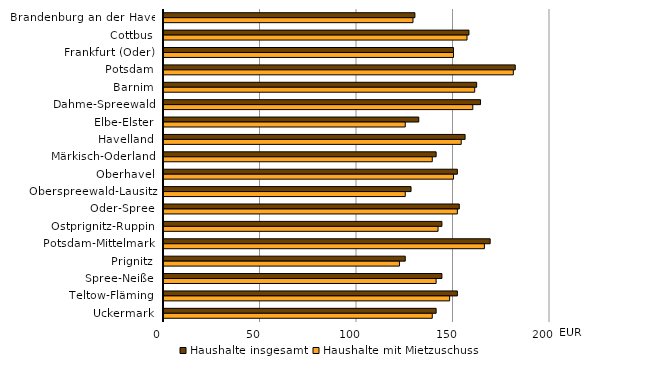
| Category | Haushalte insgesamt | Haushalte mit Mietzuschuss |
|---|---|---|
| Brandenburg an der Havel | 130 | 129 |
| Cottbus | 158 | 157 |
| Frankfurt (Oder) | 150 | 150 |
| Potsdam | 182 | 181 |
| Barnim | 162 | 161 |
| Dahme-Spreewald | 164 | 160 |
| Elbe-Elster | 132 | 125 |
| Havelland | 156 | 154 |
| Märkisch-Oderland | 141 | 139 |
| Oberhavel | 152 | 150 |
| Oberspreewald-Lausitz | 128 | 125 |
| Oder-Spree | 153 | 152 |
| Ostprignitz-Ruppin | 144 | 142 |
| Potsdam-Mittelmark | 169 | 166 |
| Prignitz | 125 | 122 |
| Spree-Neiße | 144 | 141 |
| Teltow-Fläming | 152 | 148 |
| Uckermark | 141 | 139 |